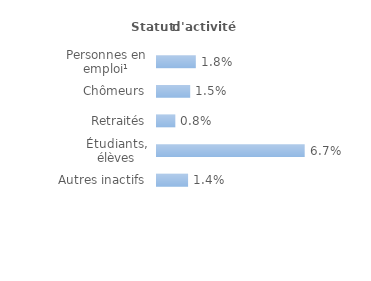
| Category | Series 0 |
|---|---|
| Personnes en emploi¹ | 0.018 |
| Chômeurs | 0.015 |
| Retraités | 0.008 |
| Étudiants, élèves | 0.067 |
| Autres inactifs  | 0.014 |